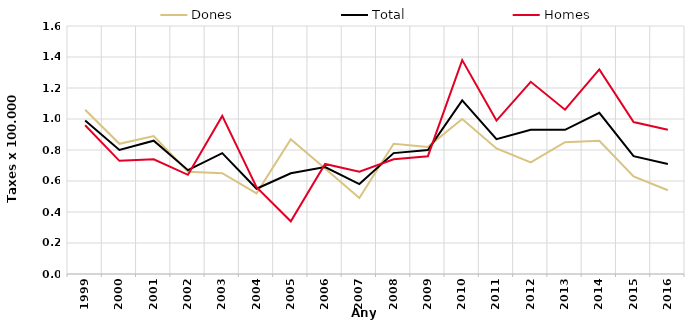
| Category | Dones | Total | Homes |
|---|---|---|---|
| 1999.0 | 1.06 | 0.99 | 0.96 |
| 2000.0 | 0.84 | 0.8 | 0.73 |
| 2001.0 | 0.89 | 0.86 | 0.74 |
| 2002.0 | 0.66 | 0.67 | 0.64 |
| 2003.0 | 0.65 | 0.78 | 1.02 |
| 2004.0 | 0.52 | 0.55 | 0.56 |
| 2005.0 | 0.87 | 0.65 | 0.34 |
| 2006.0 | 0.68 | 0.69 | 0.71 |
| 2007.0 | 0.49 | 0.58 | 0.66 |
| 2008.0 | 0.84 | 0.78 | 0.74 |
| 2009.0 | 0.82 | 0.8 | 0.76 |
| 2010.0 | 1 | 1.12 | 1.38 |
| 2011.0 | 0.81 | 0.87 | 0.99 |
| 2012.0 | 0.72 | 0.93 | 1.24 |
| 2013.0 | 0.85 | 0.93 | 1.06 |
| 2014.0 | 0.86 | 1.04 | 1.32 |
| 2015.0 | 0.63 | 0.76 | 0.98 |
| 2016.0 | 0.54 | 0.71 | 0.93 |